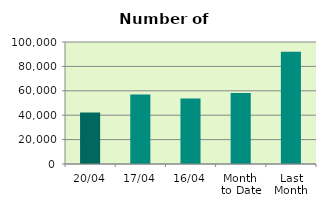
| Category | Series 0 |
|---|---|
| 20/04 | 42202 |
| 17/04 | 56970 |
| 16/04 | 53710 |
| Month 
to Date | 58168.667 |
| Last
Month | 92104.455 |